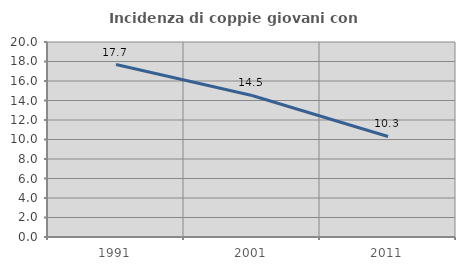
| Category | Incidenza di coppie giovani con figli |
|---|---|
| 1991.0 | 17.692 |
| 2001.0 | 14.516 |
| 2011.0 | 10.308 |